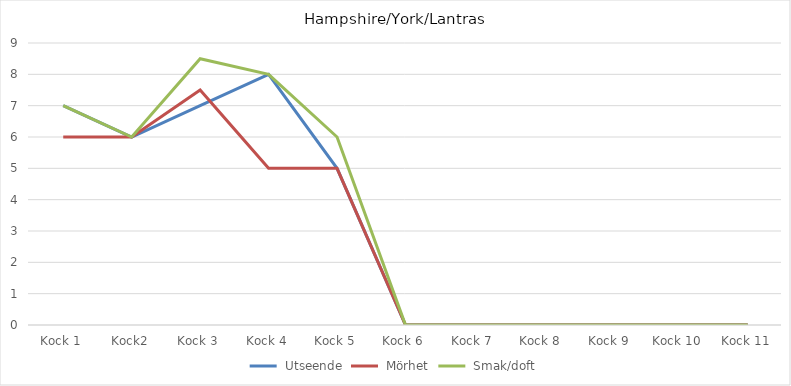
| Category | Utseende | Mörhet | Smak/doft |
|---|---|---|---|
| Kock 1 | 7 | 6 | 7 |
| Kock2 | 6 | 6 | 6 |
| Kock 3 | 7 | 7.5 | 8.5 |
| Kock 4 | 8 | 5 | 8 |
| Kock 5 | 5 | 5 | 6 |
| Kock 6 | 0 | 0 | 0 |
| Kock 7 | 0 | 0 | 0 |
| Kock 8 | 0 | 0 | 0 |
| Kock 9 | 0 | 0 | 0 |
| Kock 10 | 0 | 0 | 0 |
| Kock 11 | 0 | 0 | 0 |